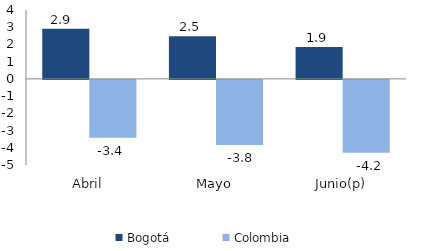
| Category | Bogotá | Colombia |
|---|---|---|
| Abril | 2.905 | -3.362 |
| Mayo | 2.473 | -3.777 |
| Junio(p) | 1.858 | -4.237 |